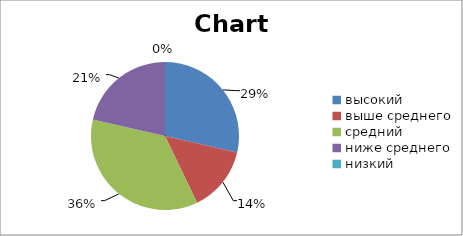
| Category | Series 0 |
|---|---|
| высокий | 4 |
| выше среднего | 2 |
| средний | 5 |
| ниже среднего | 3 |
| низкий | 0 |